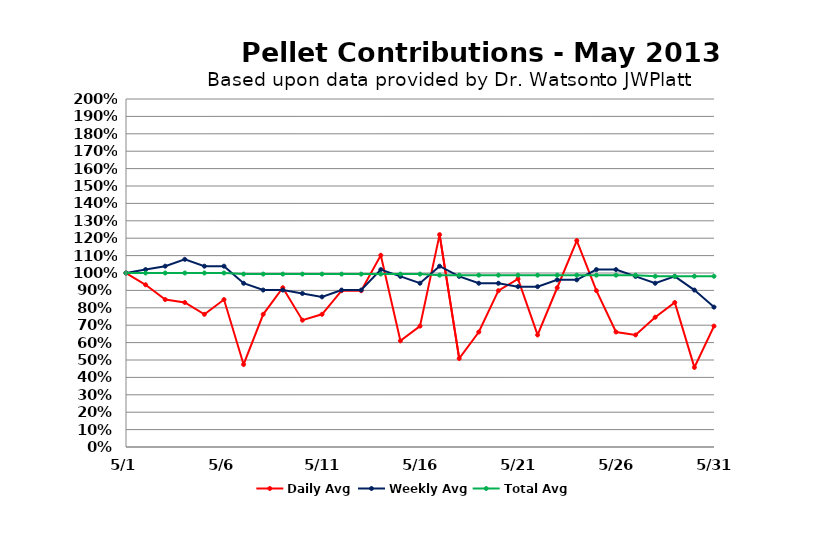
| Category | Daily Avg | Weekly Avg | Total Avg |
|---|---|---|---|
| 2013-05-01 | 1 | 1 | 1 |
| 2013-05-02 | 0.932 | 1.02 | 1 |
| 2013-05-03 | 0.847 | 1.039 | 1 |
| 2013-05-04 | 0.831 | 1.078 | 1 |
| 2013-05-05 | 0.763 | 1.039 | 1 |
| 2013-05-06 | 0.847 | 1.039 | 1 |
| 2013-05-07 | 0.475 | 0.941 | 0.994 |
| 2013-05-08 | 0.763 | 0.902 | 0.994 |
| 2013-05-09 | 0.915 | 0.902 | 0.994 |
| 2013-05-10 | 0.729 | 0.882 | 0.994 |
| 2013-05-11 | 0.763 | 0.863 | 0.994 |
| 2013-05-12 | 0.898 | 0.902 | 0.994 |
| 2013-05-13 | 0.898 | 0.902 | 0.994 |
| 2013-05-14 | 1.102 | 1.02 | 0.994 |
| 2013-05-15 | 0.61 | 0.98 | 0.994 |
| 2013-05-16 | 0.695 | 0.941 | 0.994 |
| 2013-05-17 | 1.22 | 1.039 | 0.988 |
| 2013-05-18 | 0.508 | 0.98 | 0.988 |
| 2013-05-19 | 0.661 | 0.941 | 0.988 |
| 2013-05-20 | 0.898 | 0.941 | 0.988 |
| 2013-05-21 | 0.966 | 0.922 | 0.988 |
| 2013-05-22 | 0.644 | 0.922 | 0.988 |
| 2013-05-23 | 0.915 | 0.961 | 0.988 |
| 2013-05-24 | 1.186 | 0.961 | 0.988 |
| 2013-05-25 | 0.898 | 1.02 | 0.988 |
| 2013-05-26 | 0.661 | 1.02 | 0.988 |
| 2013-05-27 | 0.644 | 0.98 | 0.988 |
| 2013-05-28 | 0.746 | 0.941 | 0.981 |
| 2013-05-29 | 0.831 | 0.98 | 0.981 |
| 2013-05-30 | 0.458 | 0.902 | 0.981 |
| 2013-05-31 | 0.695 | 0.804 | 0.981 |